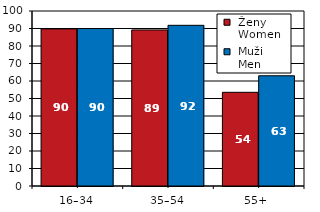
| Category |  Ženy 
 Women |  Muži 
 Men |
|---|---|---|
| 16–34 | 89.77 | 89.97 |
| 35–54 | 89.18 | 91.82 |
| 55+  | 53.54 | 62.99 |